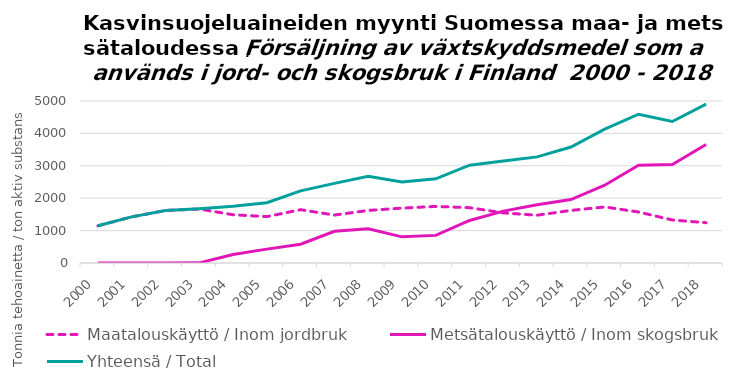
| Category | Maatalouskäyttö / Inom jordbruk | Metsätalouskäyttö / Inom skogsbruk | Yhteensä / Total |
|---|---|---|---|
| 2000.0 | 1147.3 | 3.2 | 1150.5 |
| 2001.0 | 1423.2 | 1.4 | 1424.6 |
| 2002.0 | 1620.2 | 0.8 | 1621 |
| 2003.0 | 1666.6 | 4.3 | 1670.9 |
| 2004.0 | 1488.9 | 260.2 | 1749.1 |
| 2005.0 | 1431 | 428.5 | 1859.5 |
| 2006.0 | 1645.3 | 581 | 2226.3 |
| 2007.0 | 1479.4 | 977.1 | 2456.5 |
| 2008.0 | 1621.9 | 1053.5 | 2675.4 |
| 2009.0 | 1693.8 | 807.5 | 2501.3 |
| 2010.0 | 1746.7 | 852.3 | 2599 |
| 2011.0 | 1707.5 | 1311.7 | 3019.2 |
| 2012.0 | 1545.2 | 1601 | 3146.2 |
| 2013.0 | 1475.4 | 1799.3 | 3274.7 |
| 2014.0 | 1622.3 | 1958.2 | 3580.5 |
| 2015.0 | 1730.468 | 2400.9 | 4131.368 |
| 2016.0 | 1574.541 | 3017.1 | 4591.641 |
| 2017.0 | 1327.2 | 3038.7 | 4365.9 |
| 2018.0 | 1243.5 | 3659.6 | 4903.1 |